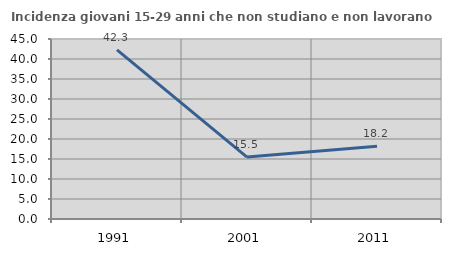
| Category | Incidenza giovani 15-29 anni che non studiano e non lavorano  |
|---|---|
| 1991.0 | 42.282 |
| 2001.0 | 15.484 |
| 2011.0 | 18.214 |